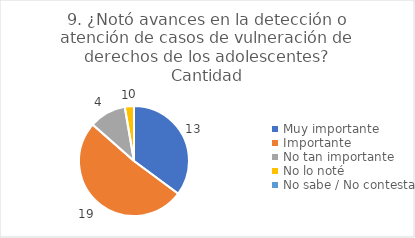
| Category | 9. ¿Notó avances en la detección o atención de casos de vulneración de derechos de los adolescentes? |
|---|---|
| Muy importante  | 0.351 |
| Importante  | 0.514 |
| No tan importante  | 0.108 |
| No lo noté  | 0.027 |
| No sabe / No contesta | 0 |